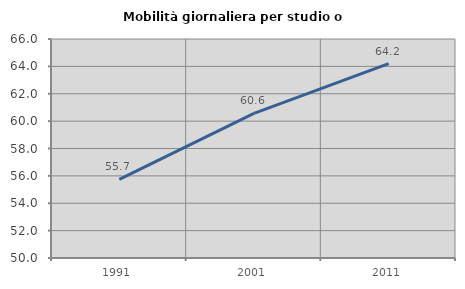
| Category | Mobilità giornaliera per studio o lavoro |
|---|---|
| 1991.0 | 55.749 |
| 2001.0 | 60.563 |
| 2011.0 | 64.198 |